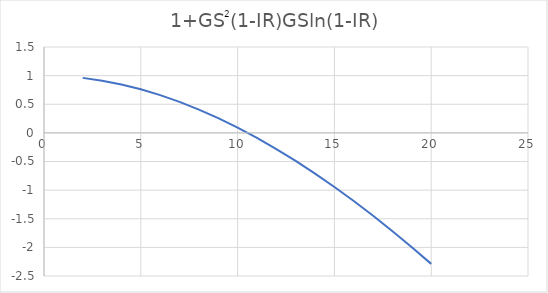
| Category | 1+GS2(1-IR)GSln(1-IR) |
|---|---|
| 2.0 | 0.961 |
| 3.0 | 0.912 |
| 4.0 | 0.846 |
| 5.0 | 0.761 |
| 6.0 | 0.659 |
| 7.0 | 0.541 |
| 8.0 | 0.406 |
| 9.0 | 0.256 |
| 10.0 | 0.091 |
| 11.0 | -0.089 |
| 12.0 | -0.283 |
| 13.0 | -0.49 |
| 14.0 | -0.711 |
| 15.0 | -0.945 |
| 16.0 | -1.191 |
| 17.0 | -1.448 |
| 18.0 | -1.717 |
| 19.0 | -1.997 |
| 20.0 | -2.288 |